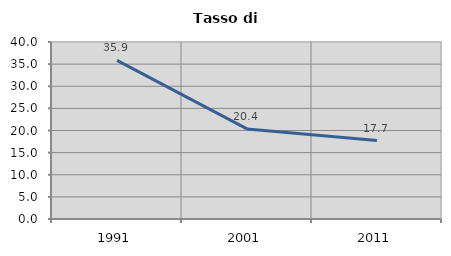
| Category | Tasso di disoccupazione   |
|---|---|
| 1991.0 | 35.863 |
| 2001.0 | 20.359 |
| 2011.0 | 17.731 |